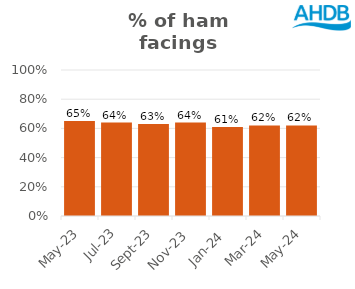
| Category | Ham |
|---|---|
| 2023-05-01 | 0.65 |
| 2023-07-01 | 0.64 |
| 2023-09-01 | 0.63 |
| 2023-11-01 | 0.64 |
| 2024-01-01 | 0.61 |
| 2024-03-01 | 0.62 |
| 2024-05-01 | 0.62 |